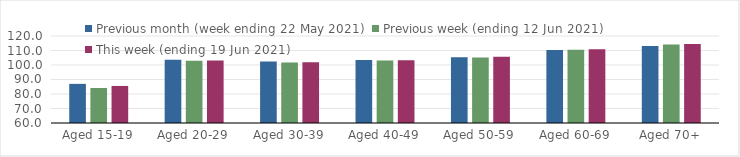
| Category | Previous month (week ending 22 May 2021) | Previous week (ending 12 Jun 2021) | This week (ending 19 Jun 2021) |
|---|---|---|---|
| Aged 15-19 | 86.99 | 84.15 | 85.55 |
| Aged 20-29 | 103.6 | 102.85 | 103.05 |
| Aged 30-39 | 102.43 | 101.79 | 101.88 |
| Aged 40-49 | 103.4 | 103.07 | 103.34 |
| Aged 50-59 | 105.31 | 105.2 | 105.63 |
| Aged 60-69 | 110.31 | 110.49 | 110.83 |
| Aged 70+ | 113.16 | 114.09 | 114.49 |